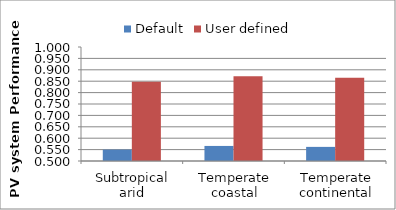
| Category | Default | User defined |
|---|---|---|
| Subtropical arid | 0.55 | 0.847 |
| Temperate coastal | 0.566 | 0.872 |
| Temperate continental | 0.562 | 0.865 |